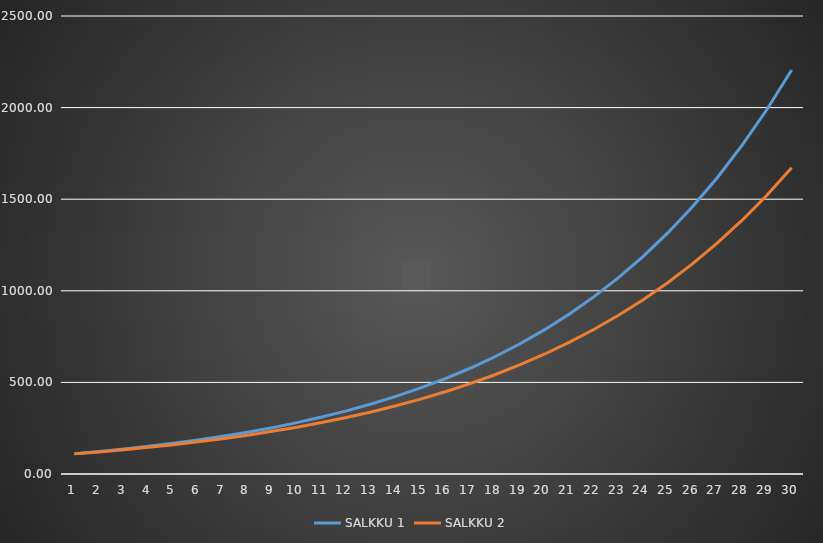
| Category | SALKKU 1 | SALKKU 2 |
|---|---|---|
| 1.0 | 110.863 | 109.842 |
| 2.0 | 122.905 | 120.654 |
| 3.0 | 136.255 | 132.529 |
| 4.0 | 151.056 | 145.573 |
| 5.0 | 167.465 | 159.901 |
| 6.0 | 185.656 | 175.64 |
| 7.0 | 205.822 | 192.927 |
| 8.0 | 228.18 | 211.916 |
| 9.0 | 252.966 | 232.774 |
| 10.0 | 280.444 | 255.684 |
| 11.0 | 310.908 | 280.85 |
| 12.0 | 344.68 | 308.493 |
| 13.0 | 382.121 | 338.856 |
| 14.0 | 423.629 | 372.208 |
| 15.0 | 469.645 | 408.843 |
| 16.0 | 520.661 | 449.083 |
| 17.0 | 577.217 | 493.284 |
| 18.0 | 639.918 | 541.835 |
| 19.0 | 709.429 | 595.166 |
| 20.0 | 786.49 | 653.745 |
| 21.0 | 871.923 | 718.09 |
| 22.0 | 966.635 | 788.767 |
| 23.0 | 1071.636 | 866.402 |
| 24.0 | 1188.043 | 951.678 |
| 25.0 | 1317.094 | 1045.346 |
| 26.0 | 1460.163 | 1148.235 |
| 27.0 | 1618.773 | 1261.25 |
| 28.0 | 1794.613 | 1385.388 |
| 29.0 | 1989.552 | 1521.745 |
| 30.0 | 2205.667 | 1671.523 |